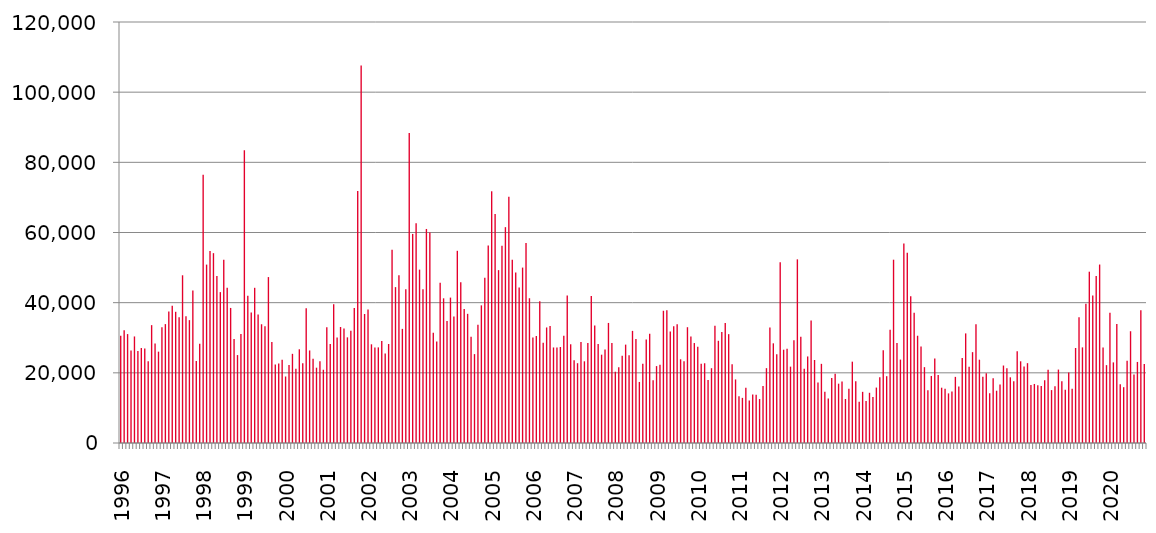
| Category | Series 0 |
|---|---|
| 1996.0 | 30565 |
| nan | 32123 |
| nan | 31044 |
| nan | 26401 |
| nan | 30370 |
| nan | 26254 |
| nan | 27073 |
| nan | 26911 |
| nan | 23273 |
| nan | 33595 |
| nan | 28374 |
| nan | 26036 |
| 1997.0 | 32963 |
| nan | 33890 |
| nan | 37509 |
| nan | 39128 |
| nan | 37399 |
| nan | 35850 |
| nan | 47806 |
| nan | 36117 |
| nan | 35023 |
| nan | 43488 |
| nan | 23397 |
| nan | 28305 |
| 1998.0 | 76429 |
| nan | 50851 |
| nan | 54713 |
| nan | 54112 |
| nan | 47617 |
| nan | 43007 |
| nan | 52250 |
| nan | 44252 |
| nan | 38498 |
| nan | 29638 |
| nan | 25062 |
| nan | 31098 |
| 1999.0 | 83423 |
| nan | 41965 |
| nan | 37191 |
| nan | 44236 |
| nan | 36632 |
| nan | 33845 |
| nan | 33248 |
| nan | 47294 |
| nan | 28815 |
| nan | 22406 |
| nan | 22665 |
| nan | 23726 |
| 2000.0 | 18950 |
| nan | 22265 |
| nan | 25419 |
| nan | 21159 |
| nan | 26713 |
| nan | 22736 |
| nan | 38395 |
| nan | 26379 |
| nan | 24035 |
| nan | 21466 |
| nan | 23271 |
| nan | 20879 |
| 2001.0 | 32965 |
| nan | 28222 |
| nan | 39557 |
| nan | 30046 |
| nan | 33063 |
| nan | 32645 |
| nan | 30113 |
| nan | 31974 |
| nan | 38459 |
| nan | 71817 |
| nan | 107589 |
| nan | 36768 |
| 2002.0 | 38060 |
| nan | 28131 |
| nan | 27242 |
| nan | 27255 |
| nan | 29074 |
| nan | 25539 |
| nan | 28215 |
| nan | 55117 |
| nan | 44435 |
| nan | 47808 |
| nan | 32529 |
| nan | 43837 |
| 2003.0 | 88327 |
| nan | 59597 |
| nan | 62620 |
| nan | 49416 |
| nan | 43798 |
| nan | 61007 |
| nan | 60030 |
| nan | 31400 |
| nan | 28943 |
| nan | 45683 |
| nan | 41241 |
| nan | 34803 |
| 2004.0 | 41446 |
| nan | 36034 |
| nan | 54779 |
| nan | 45804 |
| nan | 38217 |
| nan | 36816 |
| nan | 30279 |
| nan | 25336 |
| nan | 33712 |
| nan | 39233 |
| nan | 47110 |
| nan | 56266 |
| 2005.0 | 71750 |
| nan | 65255 |
| nan | 49275 |
| nan | 56256 |
| nan | 61526 |
| nan | 70220 |
| nan | 52226 |
| nan | 48610 |
| nan | 44307 |
| nan | 49999 |
| nan | 57010 |
| nan | 41262 |
| 2006.0 | 30057 |
| nan | 30492 |
| nan | 40434 |
| nan | 28545 |
| nan | 32934 |
| nan | 33331 |
| nan | 27232 |
| nan | 27227 |
| nan | 27362 |
| nan | 30541 |
| nan | 42045 |
| nan | 28139 |
| 2007.0 | 23612 |
| nan | 22747 |
| nan | 28800 |
| nan | 23287 |
| nan | 28534 |
| nan | 41888 |
| nan | 33468 |
| nan | 28249 |
| nan | 25173 |
| nan | 26672 |
| nan | 34222 |
| nan | 28477 |
| 2008.0 | 20317 |
| nan | 21603 |
| nan | 24900 |
| nan | 28044 |
| nan | 25045 |
| nan | 31958 |
| nan | 29617 |
| nan | 17400 |
| nan | 22606 |
| nan | 29515 |
| nan | 31141 |
| nan | 17871 |
| 2009.0 | 21922 |
| nan | 22273 |
| nan | 37691 |
| nan | 37814 |
| nan | 31759 |
| nan | 33266 |
| nan | 33847 |
| nan | 23861 |
| nan | 23337 |
| nan | 33006 |
| nan | 30362 |
| nan | 28492 |
| 2010.0 | 27450 |
| nan | 22616 |
| nan | 22731 |
| nan | 17976 |
| nan | 21322 |
| nan | 33400 |
| nan | 29135 |
| nan | 31611 |
| nan | 34182 |
| nan | 31026 |
| nan | 22439 |
| nan | 18115 |
| 2011.0 | 13316 |
| nan | 12864 |
| nan | 15754 |
| nan | 12139 |
| nan | 13789 |
| nan | 13734 |
| nan | 12532 |
| nan | 16226 |
| nan | 21335 |
| nan | 32945 |
| nan | 28411 |
| nan | 25267 |
| 2012.0 | 51510 |
| nan | 26596 |
| nan | 26832 |
| nan | 21765 |
| nan | 29303 |
| nan | 52347 |
| nan | 30268 |
| nan | 21147 |
| nan | 24668 |
| nan | 34903 |
| nan | 23658 |
| nan | 17274 |
| 2013.0 | 22563 |
| nan | 14625 |
| nan | 12699 |
| nan | 18561 |
| nan | 19723 |
| nan | 16907 |
| nan | 17520 |
| nan | 12540 |
| nan | 15437 |
| nan | 23184 |
| nan | 17588 |
| nan | 11776 |
| 2014.0 | 14586 |
| nan | 11955 |
| nan | 14313 |
| nan | 13092 |
| nan | 15802 |
| nan | 18723 |
| nan | 26437 |
| nan | 19044 |
| nan | 32284 |
| nan | 52247 |
| nan | 28493 |
| nan | 23777 |
| 2015.0 | 56844 |
| nan | 54236 |
| nan | 41842 |
| nan | 37095 |
| nan | 30576 |
| nan | 27477 |
| nan | 21618 |
| nan | 15038 |
| nan | 19111 |
| nan | 24093 |
| nan | 19410 |
| nan | 15763 |
| 2016.0 | 15437 |
| nan | 14139 |
| nan | 14651 |
| nan | 18849 |
| nan | 16093 |
| nan | 24250 |
| nan | 31240 |
| nan | 21702 |
| nan | 25896 |
| nan | 33869 |
| nan | 23745 |
| nan | 18884 |
| 2017.0 | 19855 |
| nan | 14198 |
| nan | 18466 |
| nan | 14903 |
| nan | 16658 |
| nan | 22085 |
| nan | 21288 |
| nan | 18723 |
| nan | 17630 |
| nan | 26163 |
| nan | 23289 |
| nan | 21791 |
| 2018.0 | 22760 |
| nan | 16515 |
| nan | 16828 |
| nan | 16495 |
| nan | 16238 |
| nan | 17890 |
| nan | 20891 |
| nan | 15083 |
| nan | 16174 |
| nan | 20928 |
| nan | 17597 |
| nan | 15201 |
| 2019.0 | 20124 |
| nan | 15478 |
| nan | 27086 |
| nan | 35849 |
| nan | 27253 |
| nan | 39668 |
| nan | 48828 |
| nan | 42071 |
| nan | 47584 |
| nan | 50870 |
| nan | 27234 |
| nan | 22192 |
| 2020.0 | 37109 |
| nan | 22975 |
| nan | 33939 |
| nan | 16770 |
| nan | 15910 |
| nan | 23457 |
| nan | 31858 |
| nan | 19528 |
| nan | 23104 |
| nan | 37808 |
| nan | 22500 |